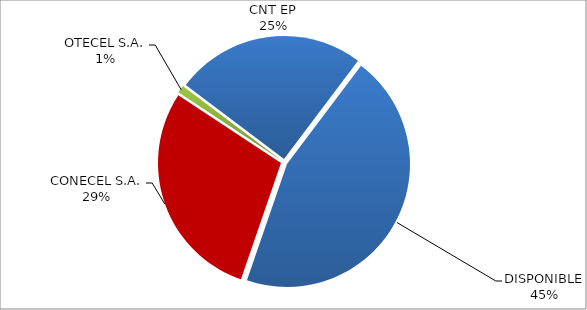
| Category | CÓDIGO DE RED 96 |
|---|---|
| CONECEL S.A. | 0.29 |
| OTECEL S.A. | 0.01 |
| CNT EP | 0.25 |
| DISPONIBLE | 0.45 |